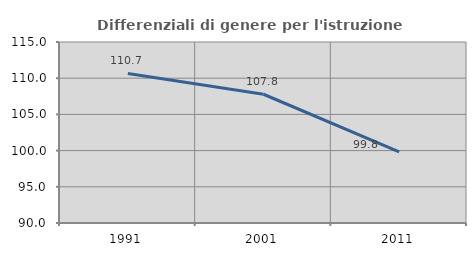
| Category | Differenziali di genere per l'istruzione superiore |
|---|---|
| 1991.0 | 110.652 |
| 2001.0 | 107.784 |
| 2011.0 | 99.838 |